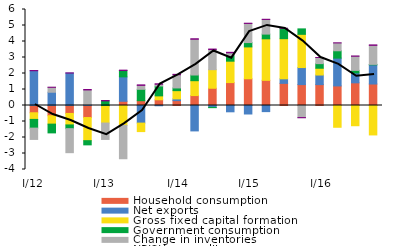
| Category | Household consumption | Net exports | Gross fixed capital formation  | Government consumption | Change in inventories | NPISH expenditure |
|---|---|---|---|---|---|---|
| I/12 | -0.454 | 2.174 | -0.415 | -0.545 | -0.706 | 0.011 |
| II | -0.638 | 0.829 | -0.527 | -0.547 | 0.309 | 0.003 |
| III | -0.496 | 2.028 | -0.718 | -0.234 | -1.502 | 0.008 |
| IV | -0.753 | 0.058 | -1.445 | -0.262 | 0.915 | 0.027 |
| I/13 | -0.014 | -0.015 | -1.069 | 0.29 | -1.024 | 0.024 |
| II | 0.263 | 1.526 | -1.245 | 0.396 | -2.082 | 0.025 |
| III | 0.301 | -1.1 | -0.531 | 0.711 | 0.246 | 0.03 |
|  IV | 0.358 | -0.016 | 0.244 | 0.613 | 0.112 | 0.029 |
|  I/14 | 0.304 | 0.109 | 0.516 | 0.168 | 0.826 | 0.024 |
| II | 0.621 | -1.588 | 0.93 | 0.355 | 2.234 | 0.03 |
| III | 1.078 | -0.118 | 1.161 | -0.016 | 1.26 | 0.029 |
| IV | 1.432 | -0.394 | 1.338 | 0.351 | 0.174 | 0.029 |
|  I/15 | 1.67 | -0.531 | 1.992 | 0.271 | 1.196 | 0.011 |
| II | 1.573 | -0.383 | 2.595 | 0.294 | 0.915 | 0.01 |
| III | 1.384 | 0.284 | 2.508 | 0.629 | 0.018 | 0.002 |
| IV | 1.306 | 1.065 | 2.077 | 0.34 | -0.756 | -0.008 |
|  I/16 | 1.304 | 0.6 | 0.424 | 0.288 | 0.384 | 0 |
| II | 1.223 | 1.738 | -1.361 | 0.459 | 0.491 | 0.003 |
| III | 1.417 | 0.621 | -1.264 | 0.158 | 0.883 | 0.015 |
| IV | 1.343 | 1.198 | -1.839 | 0.029 | 1.19 | 0.027 |